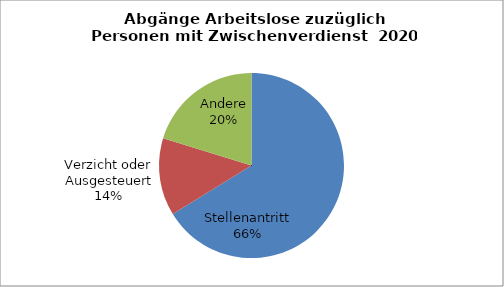
| Category | Series 0 |
|---|---|
| Stellenantritt | 0.662 |
| Verzicht oder Ausgesteuert | 0.136 |
| Andere | 0.202 |